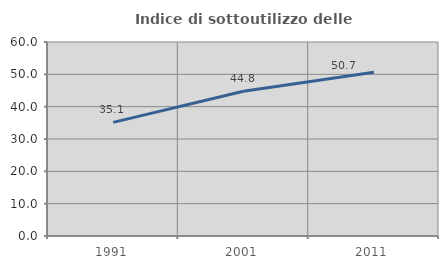
| Category | Indice di sottoutilizzo delle abitazioni  |
|---|---|
| 1991.0 | 35.135 |
| 2001.0 | 44.789 |
| 2011.0 | 50.67 |